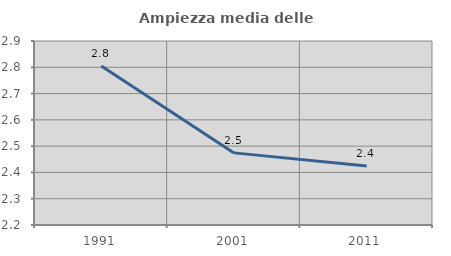
| Category | Ampiezza media delle famiglie |
|---|---|
| 1991.0 | 2.805 |
| 2001.0 | 2.474 |
| 2011.0 | 2.425 |